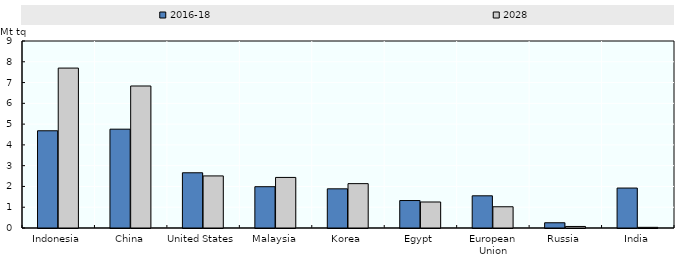
| Category | 2016-18 | 2028 |
|---|---|---|
| Indonesia | 4.679 | 7.696 |
| China | 4.756 | 6.835 |
| United States | 2.658 | 2.507 |
| Malaysia | 1.988 | 2.434 |
| Korea | 1.885 | 2.135 |
| Egypt | 1.321 | 1.252 |
| European Union | 1.549 | 1.022 |
| Russia | 0.252 | 0.074 |
| India | 1.922 | 0.032 |